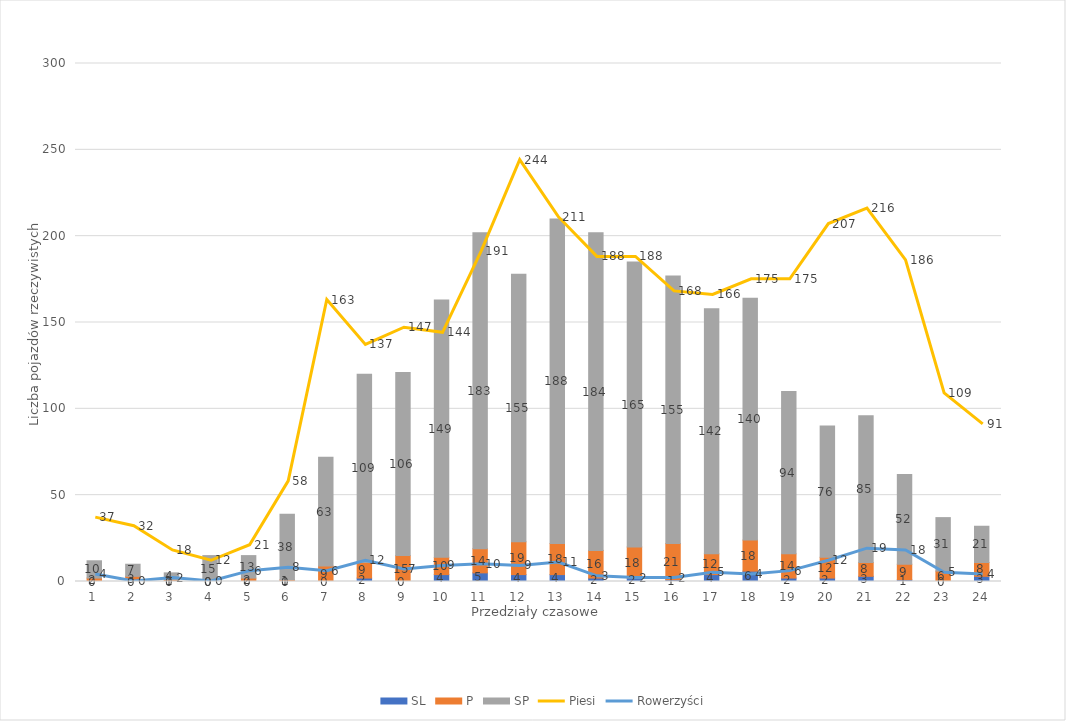
| Category | SL | P | SP |
|---|---|---|---|
| 0 | 0 | 2 | 10 |
| 1 | 0 | 3 | 7 |
| 2 | 0 | 1 | 4 |
| 3 | 0 | 0 | 15 |
| 4 | 0 | 2 | 13 |
| 5 | 0 | 1 | 38 |
| 6 | 0 | 9 | 63 |
| 7 | 2 | 9 | 109 |
| 8 | 0 | 15 | 106 |
| 9 | 4 | 10 | 149 |
| 10 | 5 | 14 | 183 |
| 11 | 4 | 19 | 155 |
| 12 | 4 | 18 | 188 |
| 13 | 2 | 16 | 184 |
| 14 | 2 | 18 | 165 |
| 15 | 1 | 21 | 155 |
| 16 | 4 | 12 | 142 |
| 17 | 6 | 18 | 140 |
| 18 | 2 | 14 | 94 |
| 19 | 2 | 12 | 76 |
| 20 | 3 | 8 | 85 |
| 21 | 1 | 9 | 52 |
| 22 | 0 | 6 | 31 |
| 23 | 3 | 8 | 21 |